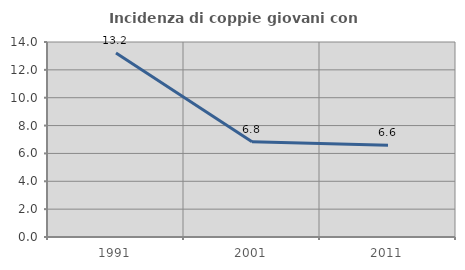
| Category | Incidenza di coppie giovani con figli |
|---|---|
| 1991.0 | 13.202 |
| 2001.0 | 6.838 |
| 2011.0 | 6.589 |